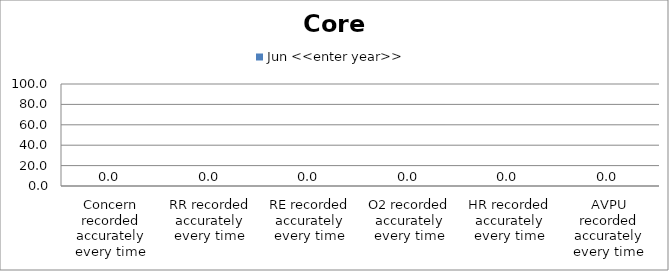
| Category | Jun <<enter year>> |
|---|---|
| Concern recorded accurately every time | 0 |
| RR recorded accurately every time | 0 |
| RE recorded accurately every time | 0 |
| O2 recorded accurately every time | 0 |
| HR recorded accurately every time | 0 |
| AVPU recorded accurately every time | 0 |